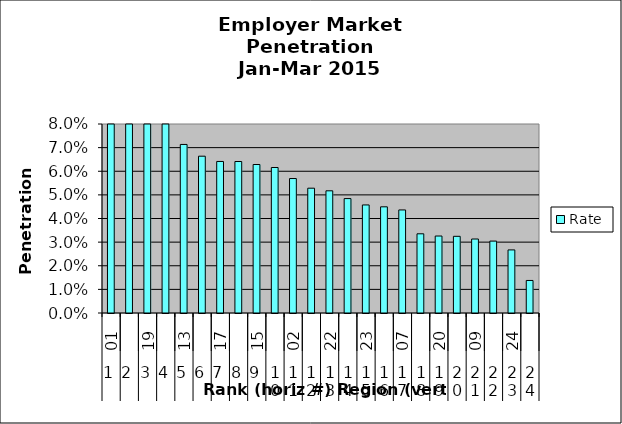
| Category | Rate |
|---|---|
| 0 | 0.104 |
| 1 | 0.103 |
| 2 | 0.094 |
| 3 | 0.089 |
| 4 | 0.071 |
| 5 | 0.066 |
| 6 | 0.064 |
| 7 | 0.064 |
| 8 | 0.063 |
| 9 | 0.062 |
| 10 | 0.057 |
| 11 | 0.053 |
| 12 | 0.052 |
| 13 | 0.048 |
| 14 | 0.046 |
| 15 | 0.045 |
| 16 | 0.044 |
| 17 | 0.034 |
| 18 | 0.033 |
| 19 | 0.032 |
| 20 | 0.031 |
| 21 | 0.03 |
| 22 | 0.027 |
| 23 | 0.014 |